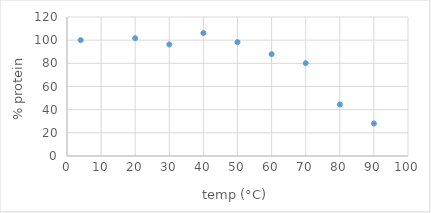
| Category | Series 0 |
|---|---|
| 4.0 | 100 |
| 20.0 | 101.67 |
| 30.0 | 96.291 |
| 40.0 | 106.199 |
| 50.0 | 98.3 |
| 60.0 | 87.911 |
| 70.0 | 80.134 |
| 80.0 | 44.454 |
| 90.0 | 28.098 |